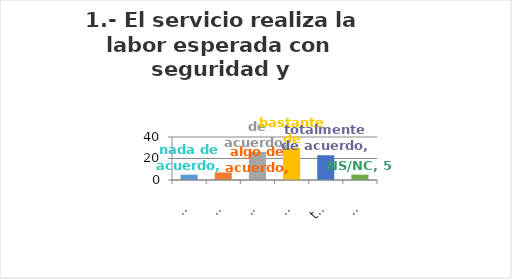
| Category | Series 0 |
|---|---|
| nada de acuerdo | 5 |
| algo de acuerdo | 7 |
| de acuerdo | 26 |
| bastante de acuerdo | 30 |
| totalmente de acuerdo | 23 |
| NS/NC | 5 |